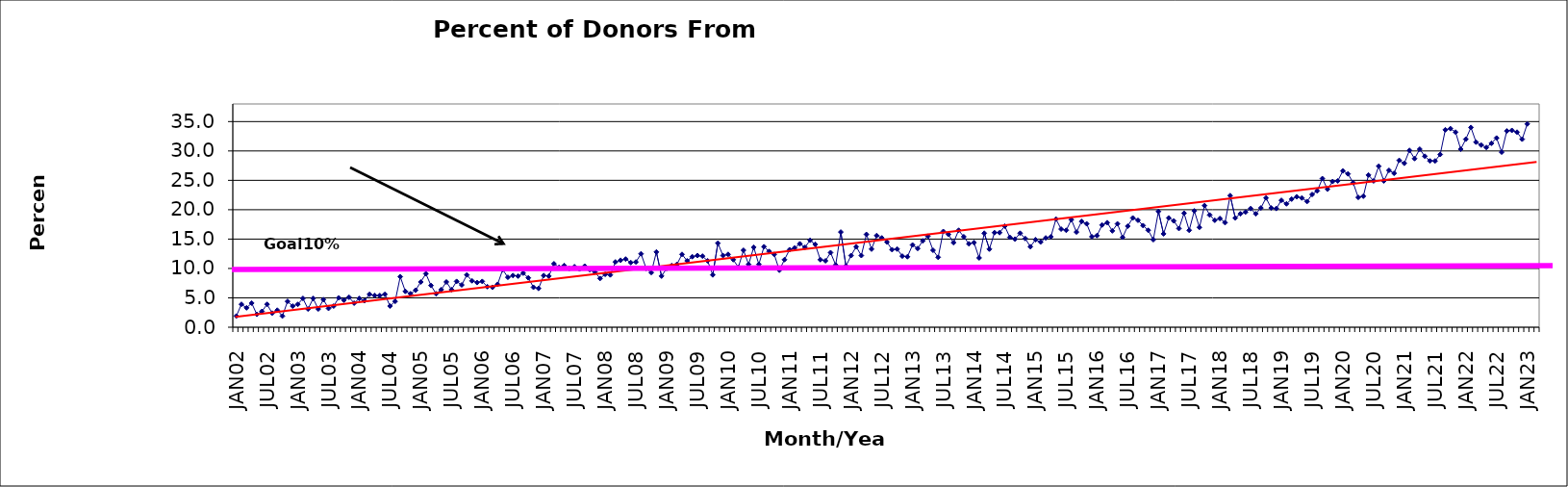
| Category | Series 0 |
|---|---|
| JAN02 | 1.9 |
| FEB02 | 3.9 |
| MAR02 | 3.3 |
| APR02 | 4.1 |
| MAY02 | 2.2 |
| JUN02 | 2.7 |
| JUL02 | 3.9 |
| AUG02 | 2.4 |
| SEP02 | 2.9 |
| OCT02 | 1.9 |
| NOV02 | 4.4 |
| DEC02 | 3.6 |
| JAN03 | 3.9 |
| FEB03 | 4.9 |
| MAR03 | 3.1 |
| APR03 | 4.9 |
| MAY03 | 3.1 |
| JUN03 | 4.7 |
| JUL03 | 3.2 |
| AUG03 | 3.6 |
| SEP03 | 5 |
| OCT03 | 4.6 |
| NOV03 | 5.1 |
| DEC03 | 4.1 |
| JAN04 | 4.9 |
| FEB04 | 4.5 |
| MAR04 | 5.6 |
| APR04 | 5.4 |
| MAY04 | 5.4 |
| JUN04 | 5.6 |
| JUL04 | 3.6 |
| AUG04 | 4.4 |
| SEP04 | 8.6 |
| OCT04 | 6.1 |
| NOV04 | 5.7 |
| DEC04 | 6.3 |
| JAN05 | 7.7 |
| FEB05 | 9.1 |
| MAR05 | 7.1 |
| APR05 | 5.7 |
| MAY05 | 6.4 |
| JUN05 | 7.7 |
| JUL05 | 6.4 |
| AUG05 | 7.8 |
| SEP05 | 7.2 |
| OCT05 | 8.9 |
| NOV05 | 7.9 |
| DEC05 | 7.6 |
| JAN06 | 7.8 |
| FEB06 | 6.9 |
| MAR06 | 6.8 |
| APR06 | 7.3 |
| MAY06 | 9.8 |
| JUN06 | 8.5 |
| JUL06 | 8.8 |
| AUG06 | 8.7 |
| SEP06 | 9.2 |
| OCT06 | 8.4 |
| NOV06 | 6.8 |
| DEC06 | 6.6 |
| JAN07 | 8.8 |
| FEB07 | 8.7 |
| MAR07 | 10.8 |
| APR07 | 10.2 |
| MAY07 | 10.5 |
| JUN07 | 10 |
| JUL07 | 10.3 |
| AUG07 | 9.9 |
| SEP07 | 10.4 |
| OCT07 | 9.8 |
| NOV07 | 9.4 |
| DEC07 | 8.3 |
| JAN08 | 9 |
| FEB08 | 8.9 |
| MAR08 | 11.1 |
| APR08 | 11.4 |
| MAY08 | 11.6 |
| JUN08 | 11 |
| JUL08 | 11.1 |
| AUG08 | 12.5 |
| SEP08 | 10 |
| OCT08 | 9.3 |
| NOV08 | 12.8 |
| DEC08 | 8.7 |
| JAN09 | 10 |
| FEB09 | 10.5 |
| MAR09 | 10.7 |
| APR09 | 12.4 |
| MAY09 | 11.3 |
| JUN09 | 12 |
| JUL09 | 12.2 |
| AUG09 | 12.1 |
| SEP09 | 11.3 |
| OCT09 | 8.9 |
| NOV09 | 14.3 |
| DEC09 | 12.2 |
| JAN10 | 12.4 |
| FEB10 | 11.5 |
| MAR10 | 10.2 |
| APR10 | 13.1 |
| MAY10 | 10.7 |
| JUN10 | 13.6 |
| JUL10 | 10.7 |
| AUG10 | 13.7 |
| SEP10 | 12.9 |
| OCT10 | 12.4 |
| NOV10 | 9.7 |
| DEC10 | 11.5 |
| JAN11 | 13.2 |
| FEB11 | 13.5 |
| MAR11 | 14.2 |
| APR11 | 13.6 |
| MAY11 | 14.8 |
| JUN11 | 14.1 |
| JUL11 | 11.5 |
| AUG11 | 11.3 |
| SEP11 | 12.7 |
| OCT11 | 10.6 |
| NOV11 | 16.2 |
| DEC11 | 10.4 |
| JAN12 | 12.2 |
| FEB12 | 13.7 |
| MAR12 | 12.2 |
| APR12 | 15.8 |
| MAY12 | 13.3 |
| JUN12 | 15.6 |
| JUL12 | 15.2 |
| AUG12 | 14.5 |
| SEP12 | 13.2 |
| OCT12 | 13.3 |
| NOV12 | 12.1 |
| DEC12 | 12 |
| JAN13 | 14 |
| FEB13 | 13.4 |
| MAR13 | 14.7 |
| APR13 | 15.5 |
| MAY13 | 13.1 |
| JUN13 | 11.9 |
| JUL13 | 16.3 |
| AUG13 | 15.8 |
| SEP13 | 14.4 |
| OCT13 | 16.5 |
| NOV13 | 15.4 |
| DEC13 | 14.2 |
| JAN14 | 14.4 |
| FEB14 | 11.8 |
| MAR14 | 16 |
| APR14 | 13.3 |
| MAY14 | 16.1 |
| JUN14 | 16.1 |
| JUL14 | 17.2 |
| AUG14 | 15.3 |
| SEP14 | 15 |
| OCT14 | 16 |
| NOV14 | 15.1 |
| DEC14 | 13.7 |
| JAN15 | 14.9 |
| FEB15 | 14.5 |
| MAR15 | 15.2 |
| APR15 | 15.4 |
| MAY15 | 18.4 |
| JUN15 | 16.7 |
| JUL15 | 16.5 |
| AUG15 | 18.3 |
| SEP15 | 16.2 |
| OCT15 | 18 |
| NOV15 | 17.6 |
| DEC15 | 15.4 |
| JAN16 | 15.6 |
| FEB16 | 17.4 |
| MAR16 | 17.8 |
| APR16 | 16.4 |
| MAY16 | 17.6 |
| JUN16 | 15.3 |
| JUL16 | 17.2 |
| AUG16 | 18.6 |
| SEP16 | 18.2 |
| OCT16 | 17.3 |
| NOV16 | 16.5 |
| DEC16 | 14.9 |
| JAN17 | 19.7 |
| FEB17 | 15.9 |
| MAR17 | 18.6 |
| APR17 | 18.1 |
| MAY17 | 16.8 |
| JUN17 | 19.4 |
| JUL17 | 16.5 |
| AUG17 | 19.8 |
| SEP17 | 17 |
| OCT17 | 20.7 |
| NOV17 | 19.1 |
| DEC17 | 18.2 |
| JAN18 | 18.5 |
| FEB18 | 17.8 |
| MAR18 | 22.4 |
| APR18 | 18.6 |
| MAY18 | 19.3 |
| JUN18 | 19.6 |
| JUL18 | 20.2 |
| AUG18 | 19.3 |
| SEP18 | 20.3 |
| OCT18 | 22 |
| NOV18 | 20.3 |
| DEC18 | 20.2 |
| JAN19 | 21.6 |
| FEB19 | 21 |
| MAR19 | 21.8 |
| APR19 | 22.2 |
| MAY19 | 22 |
| JUN19 | 21.4 |
| JUL19 | 22.6 |
| AUG19 | 23.2 |
| SEP19 | 25.3 |
| OCT19 | 23.5 |
| NOV19 | 24.8 |
| DEC19 | 24.9 |
| JAN20 | 26.6 |
| FEB20 | 26.1 |
| MAR20 | 24.6 |
| APR20 | 22.1 |
| MAY20 | 22.3 |
| JUN20 | 25.9 |
| JUL20 | 24.9 |
| AUG20 | 27.4 |
| SEP20 | 24.9 |
| OCT20 | 26.7 |
| NOV20 | 26.2 |
| DEC20 | 28.4 |
| JAN21 | 27.9 |
| FEB21 | 30.1 |
| MAR21 | 28.7 |
| APR21 | 30.3 |
| MAY21 | 29.1 |
| JUN21 | 28.3 |
| JUL21 | 28.3 |
| AUG21 | 29.4 |
| SEP21 | 33.6 |
| OCT21 | 33.8 |
| NOV21 | 33.2 |
| DEC21 | 30.3 |
| JAN22 | 32 |
| FEB22 | 34 |
| MAR22 | 31.5 |
| APR22 | 31 |
| MAY22 | 30.6 |
| JUN22 | 31.3 |
| JUL22 | 32.2 |
| AUG22 | 29.8 |
| SEP22 | 33.4 |
| OCT22 | 33.5 |
| NOV22 | 33.2 |
| DEC22 | 32 |
| JAN23 | 34.6 |